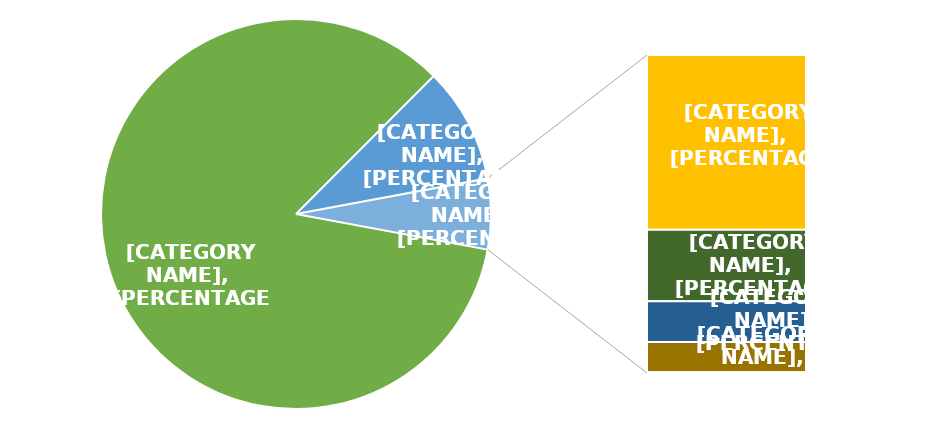
| Category | Series 0 |
|---|---|
| Investment Loan | 3676147544.841 |
| Policy-based loan | 417107500 |
| Guarantee | 139777839.315 |
| Advisory Services | 57241960.703 |
| Grant | 32555952 |
| Equity | 24223285.8 |
| Other | 630048 |